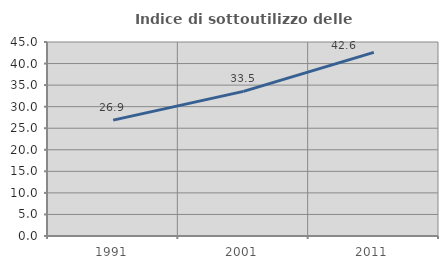
| Category | Indice di sottoutilizzo delle abitazioni  |
|---|---|
| 1991.0 | 26.87 |
| 2001.0 | 33.545 |
| 2011.0 | 42.603 |